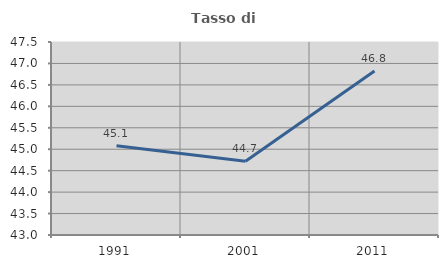
| Category | Tasso di occupazione   |
|---|---|
| 1991.0 | 45.082 |
| 2001.0 | 44.718 |
| 2011.0 | 46.822 |